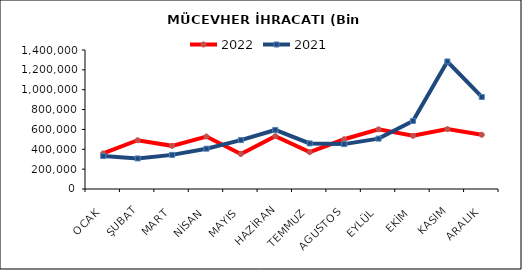
| Category | 2022 | 2021 |
|---|---|---|
| OCAK | 358948.239 | 331571.661 |
| ŞUBAT | 490992.112 | 307688.087 |
| MART | 434701.795 | 343662.147 |
| NİSAN | 528669.265 | 406145.418 |
| MAYIS | 352385.96 | 492628.344 |
| HAZİRAN | 532410.753 | 594623.314 |
| TEMMUZ | 370839.977 | 459338.497 |
| AGUSTOS | 500933.449 | 452122.422 |
| EYLÜL | 600898.363 | 507313.064 |
| EKİM | 535771.239 | 685805.493 |
| KASIM | 602903.942 | 1284244.819 |
| ARALIK | 546376.914 | 926794.168 |